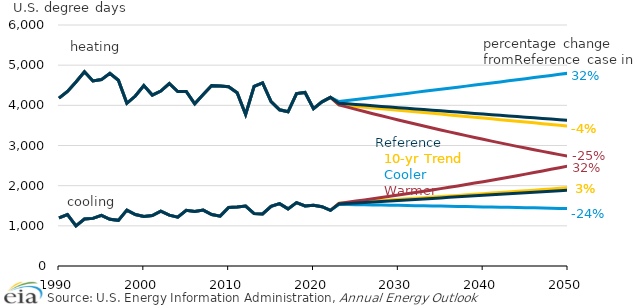
| Category | 10-yr Trend | Warmer | Cooler | Reference |
|---|---|---|---|---|
| 1990.0 | 1200.205 | 1200.205 | 1200.205 | 1200.205 |
| nan | 1281.656 | 1281.656 | 1281.656 | 1281.656 |
| nan | 1000.811 | 1000.811 | 1000.811 | 1000.811 |
| nan | 1168.724 | 1168.724 | 1168.724 | 1168.724 |
| nan | 1185.626 | 1185.626 | 1185.626 | 1185.626 |
| nan | 1261.245 | 1261.245 | 1261.245 | 1261.245 |
| nan | 1161.504 | 1161.504 | 1161.504 | 1161.504 |
| nan | 1136.596 | 1136.596 | 1136.596 | 1136.596 |
| nan | 1390.235 | 1390.235 | 1390.235 | 1390.235 |
| nan | 1281.932 | 1281.932 | 1281.932 | 1281.932 |
| 2000.0 | 1232.209 | 1232.209 | 1232.209 | 1232.209 |
| nan | 1255.346 | 1255.346 | 1255.346 | 1255.346 |
| nan | 1363.852 | 1363.852 | 1363.852 | 1363.852 |
| nan | 1267.543 | 1267.543 | 1267.543 | 1267.543 |
| nan | 1216.556 | 1216.556 | 1216.556 | 1216.556 |
| nan | 1388.479 | 1388.479 | 1388.479 | 1388.479 |
| nan | 1359.736 | 1359.736 | 1359.736 | 1359.736 |
| nan | 1391.96 | 1391.96 | 1391.96 | 1391.96 |
| nan | 1282.875 | 1282.875 | 1282.875 | 1282.875 |
| nan | 1240.884 | 1240.884 | 1240.884 | 1240.884 |
| 2010.0 | 1456.345 | 1456.345 | 1456.345 | 1456.345 |
| nan | 1468.72 | 1468.72 | 1468.72 | 1468.72 |
| nan | 1493.259 | 1493.259 | 1493.259 | 1493.259 |
| nan | 1304.124 | 1304.124 | 1304.124 | 1304.124 |
| nan | 1294.962 | 1294.962 | 1294.962 | 1294.962 |
| nan | 1483.299 | 1483.299 | 1483.299 | 1483.299 |
| nan | 1553.121 | 1553.121 | 1553.121 | 1553.121 |
| nan | 1421.939 | 1421.939 | 1421.939 | 1421.939 |
| nan | 1578.478 | 1578.478 | 1578.478 | 1578.478 |
| nan | 1494.396 | 1494.396 | 1494.396 | 1494.396 |
| 2020.0 | 1513.588 | 1513.588 | 1513.588 | 1513.588 |
| nan | 1475.97 | 1475.97 | 1475.97 | 1475.97 |
| nan | 1384.772 | 1384.772 | 1384.772 | 1384.772 |
| nan | 1562.743 | 1560.377 | 1532.682 | 1546.53 |
| nan | 1576.496 | 1588.47 | 1529.623 | 1558.908 |
| nan | 1590.195 | 1616.898 | 1526.405 | 1571.218 |
| nan | 1603.895 | 1645.728 | 1523.093 | 1583.521 |
| nan | 1617.632 | 1675.001 | 1519.723 | 1595.853 |
| nan | 1631.414 | 1704.731 | 1516.303 | 1608.219 |
| nan | 1645.251 | 1734.933 | 1512.84 | 1620.629 |
| 2030.0 | 1659.152 | 1765.62 | 1509.342 | 1633.087 |
| nan | 1673.111 | 1796.793 | 1505.803 | 1645.59 |
| nan | 1687.126 | 1828.459 | 1502.225 | 1658.135 |
| nan | 1701.194 | 1860.617 | 1498.601 | 1670.716 |
| nan | 1715.315 | 1893.276 | 1494.934 | 1683.335 |
| nan | 1729.485 | 1926.439 | 1491.221 | 1695.988 |
| nan | 1743.704 | 1960.114 | 1487.463 | 1708.674 |
| nan | 1757.975 | 1994.306 | 1483.661 | 1721.393 |
| nan | 1772.293 | 2029.02 | 1479.813 | 1734.143 |
| nan | 1786.66 | 2064.262 | 1475.92 | 1746.922 |
| 2040.0 | 1801.074 | 2100.038 | 1471.981 | 1759.729 |
| nan | 1815.537 | 2136.355 | 1467.997 | 1772.563 |
| nan | 1830.049 | 2173.221 | 1463.969 | 1785.426 |
| nan | 1844.612 | 2210.643 | 1459.899 | 1798.316 |
| nan | 1859.226 | 2248.628 | 1455.786 | 1811.233 |
| nan | 1873.888 | 2287.181 | 1451.63 | 1824.174 |
| nan | 1888.611 | 2326.309 | 1447.431 | 1837.139 |
| nan | 1903.387 | 2366.011 | 1443.185 | 1850.122 |
| nan | 1918.2 | 2406.294 | 1438.893 | 1863.12 |
| nan | 1933.053 | 2447.165 | 1434.554 | 1876.134 |
| 2050.0 | 1947.949 | 2488.636 | 1430.174 | 1889.167 |